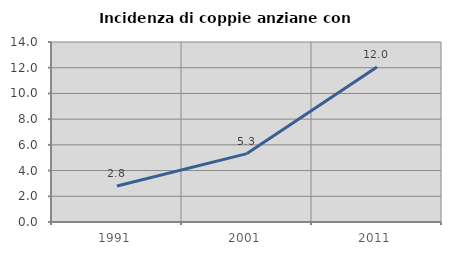
| Category | Incidenza di coppie anziane con figli |
|---|---|
| 1991.0 | 2.804 |
| 2001.0 | 5.319 |
| 2011.0 | 12.048 |